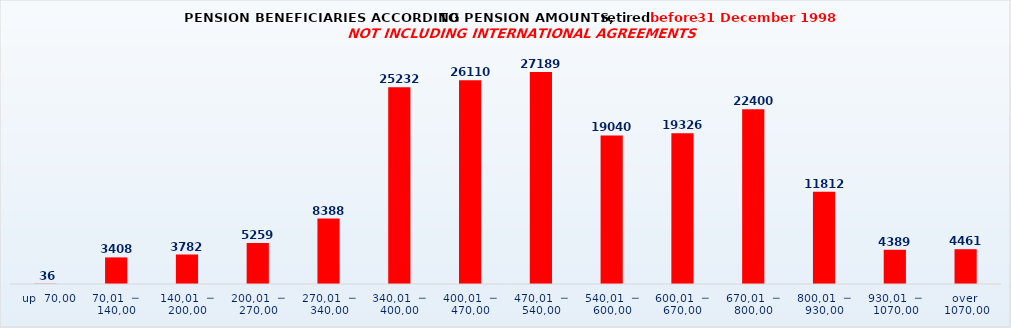
| Category | Series 0 |
|---|---|
|   up  70,00 | 36 |
| 70,01  ─  140,00 | 3408 |
| 140,01  ─  200,00 | 3782 |
| 200,01  ─  270,00 | 5259 |
| 270,01  ─  340,00 | 8388 |
| 340,01  ─  400,00 | 25232 |
| 400,01  ─  470,00 | 26110 |
| 470,01  ─  540,00 | 27189 |
| 540,01  ─  600,00 | 19040 |
| 600,01  ─  670,00 | 19326 |
| 670,01  ─  800,00 | 22400 |
| 800,01  ─  930,00 | 11812 |
| 930,01  ─  1070,00 | 4389 |
| over  1070,00 | 4461 |